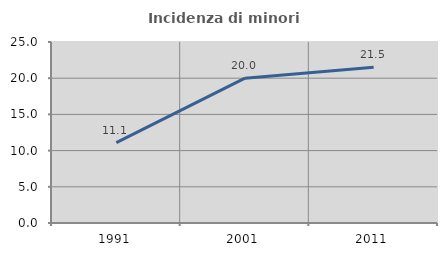
| Category | Incidenza di minori stranieri |
|---|---|
| 1991.0 | 11.111 |
| 2001.0 | 20 |
| 2011.0 | 21.519 |